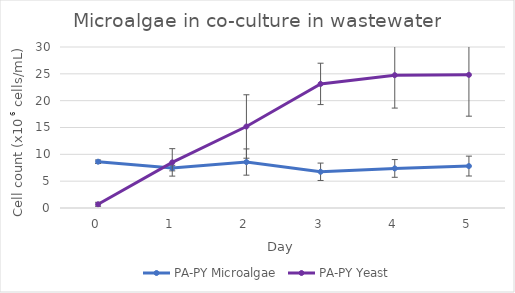
| Category | PA-PY Microalgae | PA-PY Yeast |
|---|---|---|
| 0.0 | 8.625 | 0.688 |
| 1.0 | 7.438 | 8.5 |
| 2.0 | 8.562 | 15.188 |
| 3.0 | 6.75 | 23.125 |
| 4.0 | 7.375 | 24.75 |
| 5.0 | 7.812 | 24.812 |